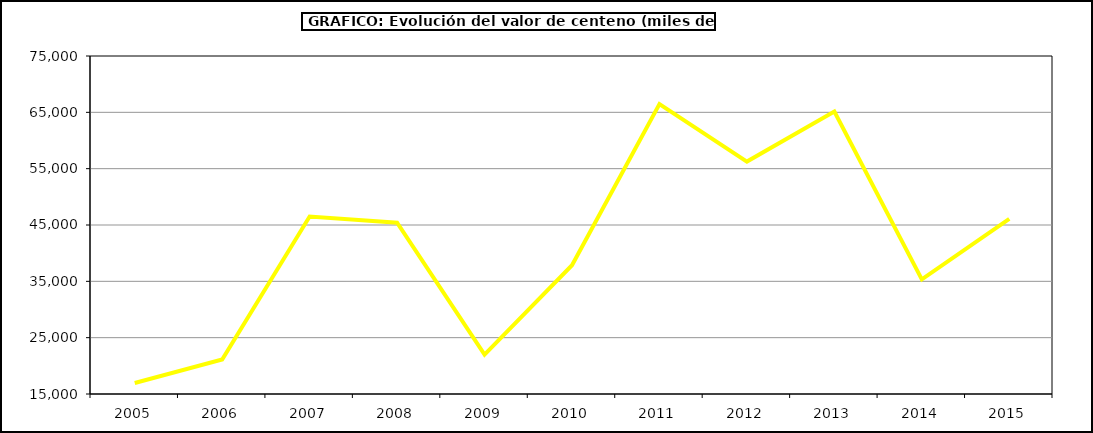
| Category | Valor |
|---|---|
| 2005.0 | 16950.305 |
| 2006.0 | 21119.616 |
| 2007.0 | 46497.545 |
| 2008.0 | 45398.884 |
| 2009.0 | 22005.119 |
| 2010.0 | 37852.67 |
| 2011.0 | 66477.888 |
| 2012.0 | 56263.16 |
| 2013.0 | 65145.46 |
| 2014.0 | 35358 |
| 2015.0 | 46088 |